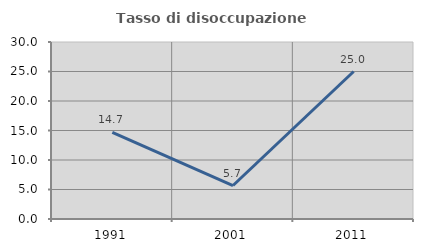
| Category | Tasso di disoccupazione giovanile  |
|---|---|
| 1991.0 | 14.697 |
| 2001.0 | 5.677 |
| 2011.0 | 25 |